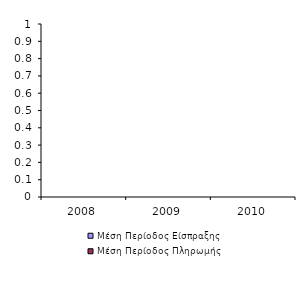
| Category | Μέση Περίοδος Είσπραξης | Μέση Περίοδος Πληρωμής |
|---|---|---|
| 2008.0 | 0 | 0 |
| 2009.0 | 0 | 0 |
| 2010.0 | 0 | 0 |